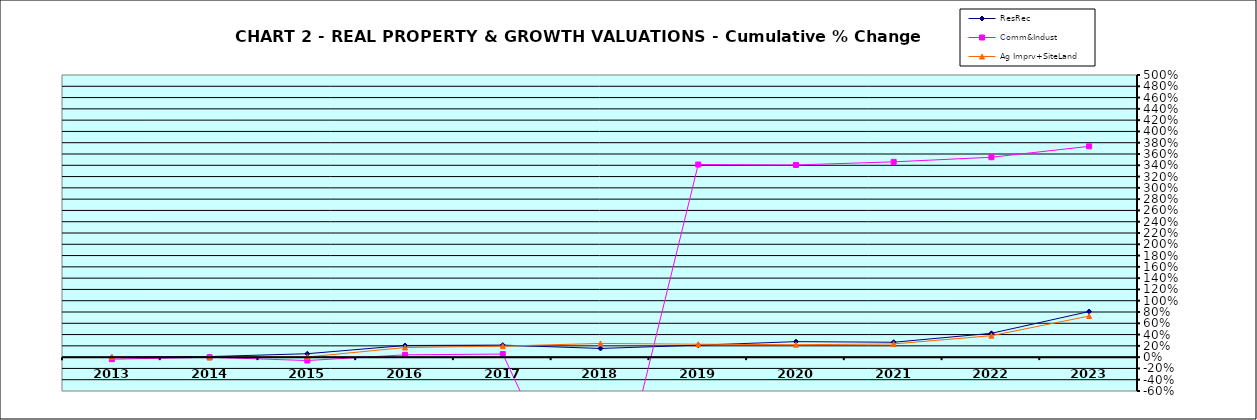
| Category | ResRec | Comm&Indust | Ag Imprv+SiteLand |
|---|---|---|---|
| 2013.0 | -0.002 | -0.036 | 0 |
| 2014.0 | 0.01 | -0.002 | -0.006 |
| 2015.0 | 0.061 | -0.06 | 0.002 |
| 2016.0 | 0.206 | 0.041 | 0.17 |
| 2017.0 | 0.213 | 0.055 | 0.195 |
| 2018.0 | 0.154 | -3.64 | 0.243 |
| 2019.0 | 0.212 | 3.413 | 0.23 |
| 2020.0 | 0.275 | 3.406 | 0.22 |
| 2021.0 | 0.264 | 3.461 | 0.234 |
| 2022.0 | 0.422 | 3.543 | 0.38 |
| 2023.0 | 0.808 | 3.736 | 0.728 |